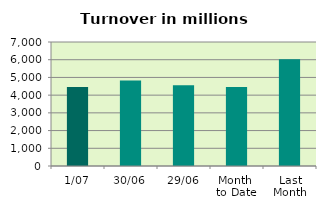
| Category | Series 0 |
|---|---|
| 1/07 | 4455.251 |
| 30/06 | 4830.059 |
| 29/06 | 4552.15 |
| Month 
to Date | 4455.251 |
| Last
Month | 6026.708 |